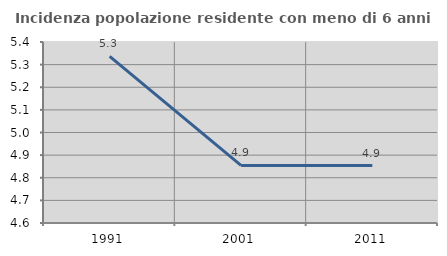
| Category | Incidenza popolazione residente con meno di 6 anni |
|---|---|
| 1991.0 | 5.336 |
| 2001.0 | 4.854 |
| 2011.0 | 4.854 |